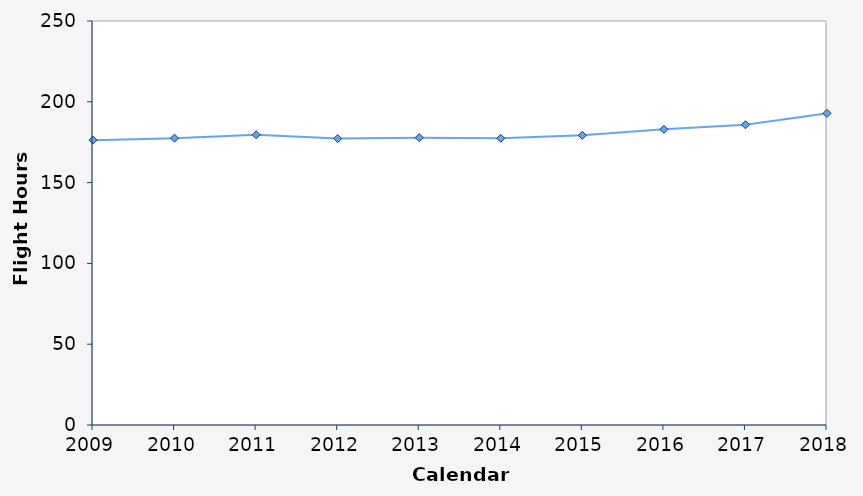
| Category | Flight Hours (100,000s) |
|---|---|
| 2009.0 | 176.268 |
| 2010.0 | 177.51 |
| 2011.0 | 179.63 |
| 2012.0 | 177.222 |
| 2013.0 | 177.796 |
| 2014.0 | 177.428 |
| 2015.0 | 179.258 |
| 2016.0 | 182.941 |
| 2017.0 | 185.814 |
| 2018.0 | 192.883 |